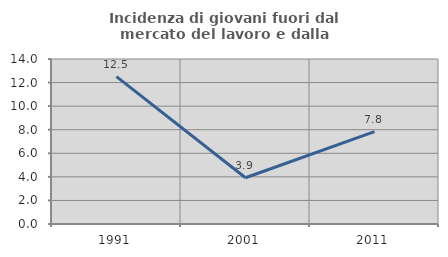
| Category | Incidenza di giovani fuori dal mercato del lavoro e dalla formazione  |
|---|---|
| 1991.0 | 12.5 |
| 2001.0 | 3.922 |
| 2011.0 | 7.843 |